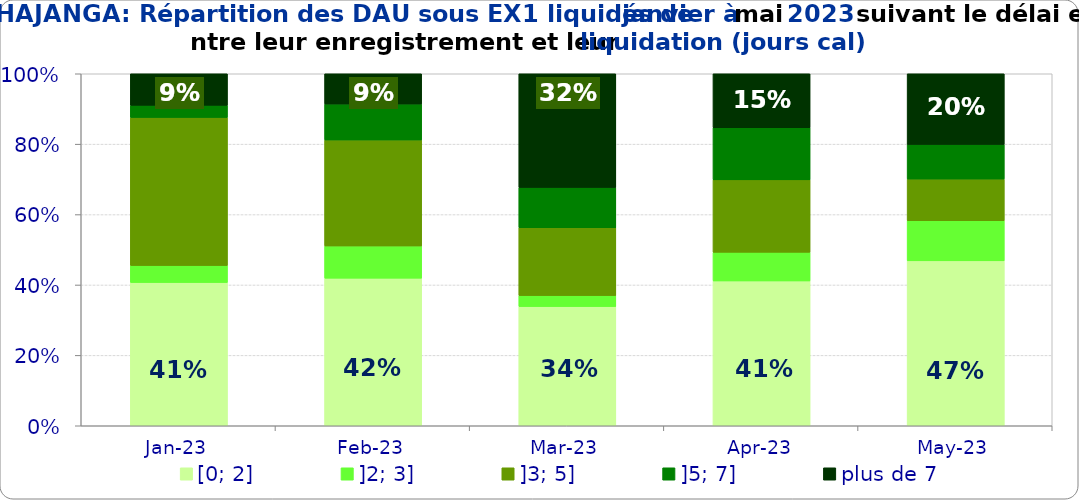
| Category | [0; 2] | ]2; 3] | ]3; 5] | ]5; 7] | plus de 7 |
|---|---|---|---|---|---|
| 2023-01-01 | 0.407 | 0.048 | 0.421 | 0.034 | 0.09 |
| 2023-02-01 | 0.419 | 0.091 | 0.301 | 0.102 | 0.086 |
| 2023-03-01 | 0.339 | 0.031 | 0.193 | 0.115 | 0.323 |
| 2023-04-01 | 0.411 | 0.081 | 0.206 | 0.148 | 0.153 |
| 2023-05-01 | 0.469 | 0.114 | 0.118 | 0.098 | 0.201 |